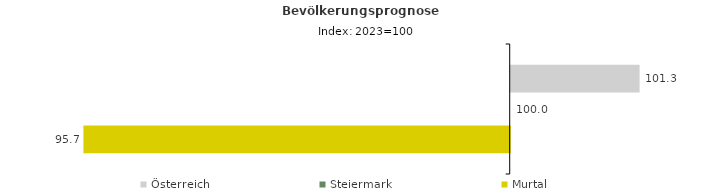
| Category | Österreich | Steiermark | Murtal |
|---|---|---|---|
| 2023.0 | 101.3 | 100 | 95.7 |